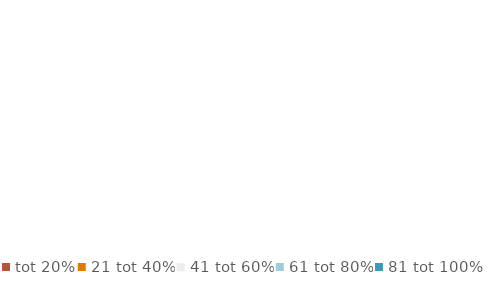
| Category | Series 0 |
|---|---|
| tot 20% | 0 |
| 21 tot 40% | 0 |
| 41 tot 60% | 0 |
| 61 tot 80% | 0 |
| 81 tot 100% | 0 |